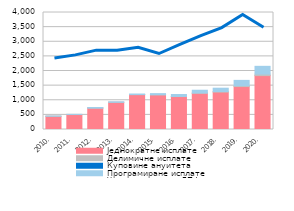
| Category | Једнократне исплате | Делимичне исплате | Куповине ануитета | Програмиране исплате |
|---|---|---|---|---|
| 2010. | 450.32 | 7.105 | 0 | 0.711 |
| 2011. | 511.736 | 4.179 | 0 | 1.631 |
| 2012. | 732.82 | 0.095 | 0 | 18.744 |
| 2013. | 930.814 | 0.362 | 0 | 14.024 |
| 2014. | 1193.016 | 1.001 | 0 | 19.359 |
| 2015. | 1186.061 | 2.555 | 0 | 37.557 |
| 2016. | 1126.417 | 4.433 | 0 | 64.785 |
| 2017. | 1237.64 | 11.65 | 0 | 93.12 |
| 2018. | 1278.16 | 21.43 | 0 | 112.35 |
| 2019. | 1468.28 | 31.41 | 0 | 180.14 |
| 2020. | 1842.9 | 50.26 | 0 | 266.48 |